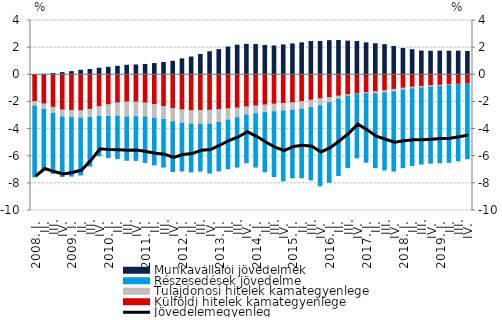
| Category | Külföldi hitelek kamategyenlege | Tulajdonosi hitelek kamategyenlege | Részesedések jövedelme  | Munkavállalói jövedelmek |
|---|---|---|---|---|
| 2008. I. | -1.964 | -0.365 | -5.194 | 0.012 |
|          II. | -2.141 | -0.413 | -4.42 | 0.031 |
|          III. | -2.392 | -0.457 | -4.413 | 0.095 |
|          IV. | -2.588 | -0.531 | -4.379 | 0.159 |
| 2009. I. | -2.624 | -0.535 | -4.307 | 0.232 |
|          II. | -2.642 | -0.566 | -4.18 | 0.332 |
|          III. | -2.552 | -0.602 | -3.568 | 0.389 |
|          IV. | -2.344 | -0.724 | -2.899 | 0.482 |
| 2010. I. | -2.203 | -0.877 | -3.023 | 0.551 |
|          II. | -2.068 | -1 | -3.117 | 0.625 |
|          III. | -1.998 | -1.136 | -3.166 | 0.7 |
|          IV. | -2.006 | -1.089 | -3.215 | 0.724 |
| 2011. I. | -2.072 | -1.051 | -3.335 | 0.762 |
|          II. | -2.189 | -1.024 | -3.425 | 0.827 |
|          III. | -2.337 | -0.958 | -3.508 | 0.906 |
|          IV. | -2.488 | -0.977 | -3.66 | 0.996 |
| 2012. I. | -2.58 | -0.994 | -3.518 | 1.174 |
|          II. | -2.639 | -0.996 | -3.522 | 1.311 |
|          III. | -2.623 | -1.031 | -3.444 | 1.499 |
|          IV. | -2.606 | -1.048 | -3.593 | 1.697 |
| 2013. I. | -2.563 | -0.952 | -3.564 | 1.853 |
| II. | -2.503 | -0.844 | -3.579 | 2.045 |
|          III. | -2.449 | -0.729 | -3.621 | 2.18 |
| IV. | -2.364 | -0.608 | -3.511 | 2.246 |
| 2014. I. | -2.292 | -0.586 | -3.921 | 2.228 |
| II. | -2.218 | -0.574 | -4.354 | 2.163 |
|          III. | -2.161 | -0.571 | -4.766 | 2.124 |
| IV. | -2.11 | -0.563 | -5.145 | 2.202 |
| 2015. I. | -2.056 | -0.566 | -4.971 | 2.273 |
| II. | -1.975 | -0.568 | -5.046 | 2.357 |
|          III. | -1.873 | -0.556 | -5.323 | 2.448 |
| IV. | -1.765 | -0.519 | -5.895 | 2.458 |
| 2016. I. | -1.673 | -0.383 | -5.863 | 2.517 |
| II. | -1.567 | -0.237 | -5.623 | 2.526 |
|          III. | -1.467 | -0.118 | -5.252 | 2.481 |
| IV. | -1.398 | -0.041 | -4.683 | 2.449 |
| 2017. I. | -1.31 | -0.092 | -5.04 | 2.352 |
| II. | -1.247 | -0.156 | -5.441 | 2.284 |
|          III. | -1.167 | -0.179 | -5.663 | 2.22 |
| IV. | -1.073 | -0.189 | -5.835 | 2.09 |
| 2018. I. | -0.982 | -0.161 | -5.701 | 1.939 |
| II. | -0.909 | -0.135 | -5.635 | 1.848 |
|          III. | -0.858 | -0.124 | -5.597 | 1.752 |
| IV. | -0.811 | -0.113 | -5.591 | 1.735 |
| 2019. I. | -0.776 | -0.092 | -5.617 | 1.746 |
| II. | -0.73 | -0.057 | -5.666 | 1.735 |
|          III. | -0.696 | -0.033 | -5.61 | 1.741 |
| IV. | -0.661 | -0.02 | -5.504 | 1.717 |